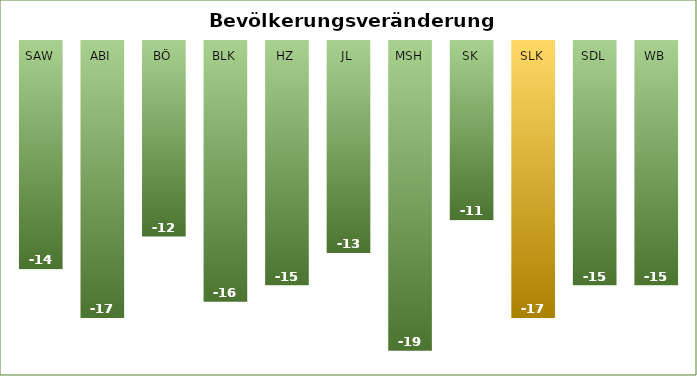
| Category | Bevölkerungsveränderung (%) |
|---|---|
| SAW | -14 |
| ABI | -17 |
| BÖ | -12 |
| BLK | -16 |
| HZ | -15 |
| JL | -13 |
| MSH | -19 |
| SK | -11 |
| SLK | -17 |
| SDL | -15 |
| WB | -15 |